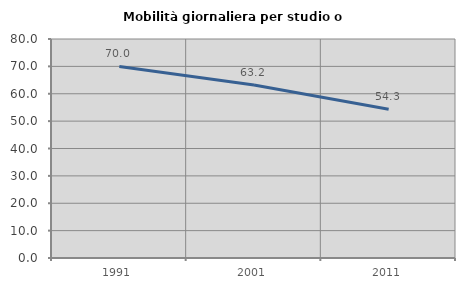
| Category | Mobilità giornaliera per studio o lavoro |
|---|---|
| 1991.0 | 69.972 |
| 2001.0 | 63.199 |
| 2011.0 | 54.305 |